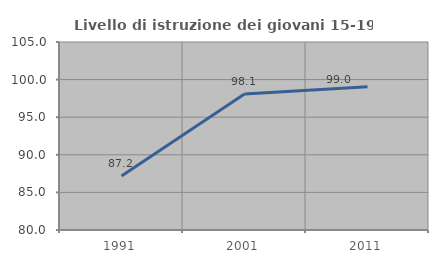
| Category | Livello di istruzione dei giovani 15-19 anni |
|---|---|
| 1991.0 | 87.189 |
| 2001.0 | 98.089 |
| 2011.0 | 99.048 |